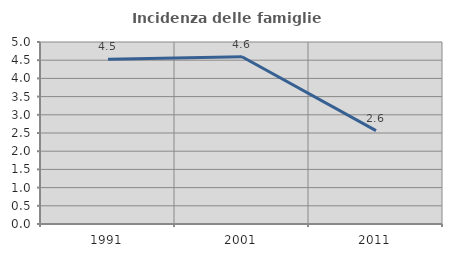
| Category | Incidenza delle famiglie numerose |
|---|---|
| 1991.0 | 4.528 |
| 2001.0 | 4.595 |
| 2011.0 | 2.564 |